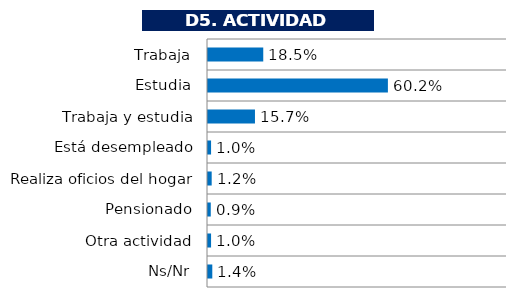
| Category | Series 0 |
|---|---|
| Trabaja | 0.185 |
| Estudia | 0.602 |
| Trabaja y estudia | 0.157 |
| Está desempleado | 0.01 |
| Realiza oficios del hogar | 0.012 |
| Pensionado | 0.009 |
| Otra actividad | 0.01 |
| Ns/Nr | 0.014 |